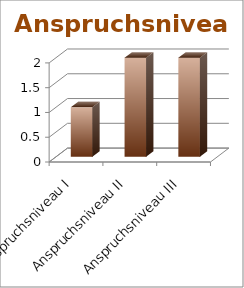
| Category | Series 0 |
|---|---|
| Anspruchsniveau I | 1 |
| Anspruchsniveau II | 2 |
| Anspruchsniveau III | 2 |